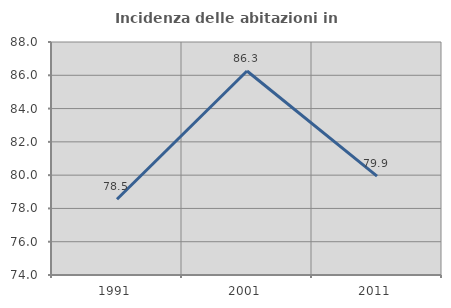
| Category | Incidenza delle abitazioni in proprietà  |
|---|---|
| 1991.0 | 78.549 |
| 2001.0 | 86.257 |
| 2011.0 | 79.945 |